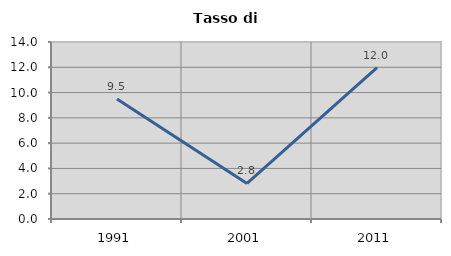
| Category | Tasso di disoccupazione   |
|---|---|
| 1991.0 | 9.487 |
| 2001.0 | 2.817 |
| 2011.0 | 11.976 |